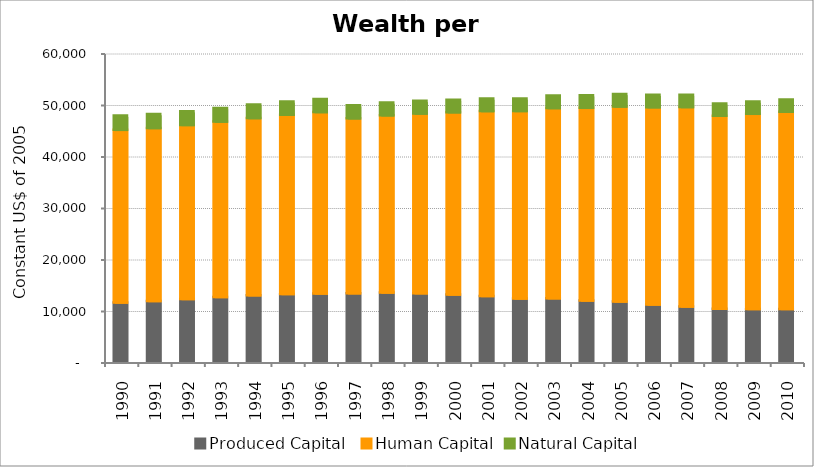
| Category | Produced Capital  | Human Capital | Natural Capital |
|---|---|---|---|
| 1990.0 | 11503.729 | 33524.864 | 2765.794 |
| 1991.0 | 11798.766 | 33591.338 | 2714.149 |
| 1992.0 | 12205.458 | 33777.647 | 2676.667 |
| 1993.0 | 12567.23 | 34065.036 | 2648.105 |
| 1994.0 | 12896.709 | 34419.412 | 2620.584 |
| 1995.0 | 13137.28 | 34818.534 | 2590.921 |
| 1996.0 | 13229.108 | 35253.975 | 2557.844 |
| 1997.0 | 13304.336 | 33965.992 | 2522.013 |
| 1998.0 | 13426.123 | 34426.078 | 2488.472 |
| 1999.0 | 13285.556 | 34911.114 | 2461.423 |
| 2000.0 | 13047.787 | 35400.568 | 2444.602 |
| 2001.0 | 12754.811 | 35919.502 | 2437.31 |
| 2002.0 | 12271.805 | 36423.231 | 2437.824 |
| 2003.0 | 12341.982 | 36917.987 | 2442.786 |
| 2004.0 | 11904.935 | 37403.552 | 2445.693 |
| 2005.0 | 11684.094 | 37875.941 | 2442.63 |
| 2006.0 | 11127.045 | 38304.396 | 2431.56 |
| 2007.0 | 10714.156 | 38737.087 | 2414.858 |
| 2008.0 | 10282.642 | 37492.063 | 2394.499 |
| 2009.0 | 10222.013 | 37926.277 | 2373.365 |
| 2010.0 | 10229.902 | 38330.575 | 2353.449 |